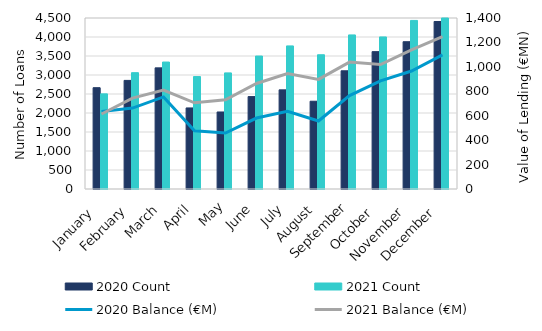
| Category | 2020 Count | 2021 Count |
|---|---|---|
| January  | 2666 | 2504 |
| February | 2858 | 3061 |
| March | 3188 | 3341 |
| April  | 2133 | 2959 |
| May | 2027 | 3055 |
| June | 2432 | 3499 |
| July | 2609 | 3766 |
| August | 2310 | 3533 |
| September | 3111 | 4055 |
| October  | 3615 | 4002 |
| November  | 3876 | 4436 |
| December  | 4408 | 4769 |